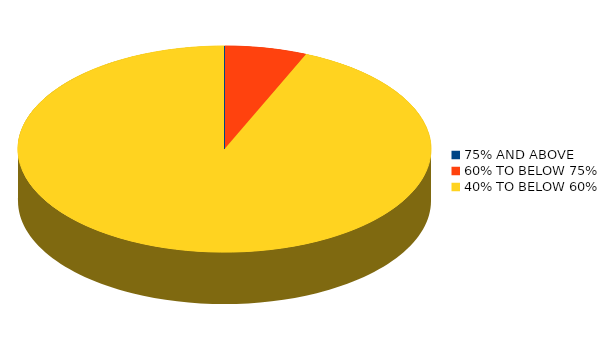
| Category | Number of students |
|---|---|
| 75% AND ABOVE | 0 |
| 60% TO BELOW 75% | 2 |
| 40% TO BELOW 60% | 29 |